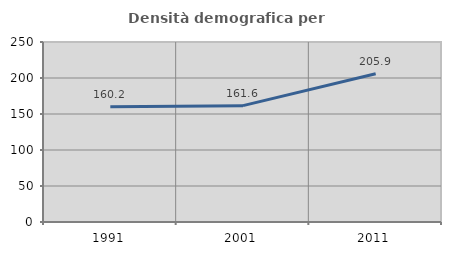
| Category | Densità demografica |
|---|---|
| 1991.0 | 160.214 |
| 2001.0 | 161.607 |
| 2011.0 | 205.929 |